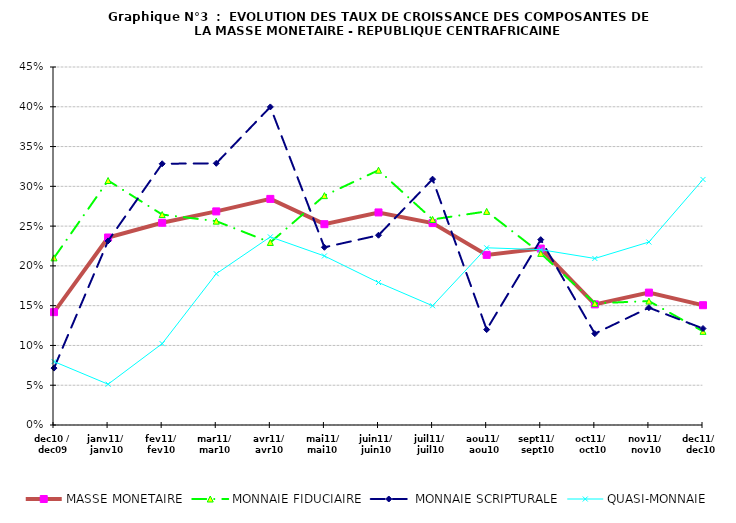
| Category | MASSE MONETAIRE | MONNAIE FIDUCIAIRE |  MONNAIE SCRIPTURALE | QUASI-MONNAIE |
|---|---|---|---|---|
| dec10 / dec09 | 0.142 | 0.21 | 0.072 | 0.08 |
| janv11/  janv10 | 0.236 | 0.307 | 0.231 | 0.051 |
| fev11/ fev10 | 0.254 | 0.265 | 0.328 | 0.102 |
| mar11/ mar10 | 0.268 | 0.256 | 0.329 | 0.19 |
| avr11/ avr10 | 0.284 | 0.229 | 0.4 | 0.236 |
| mai11/ mai10 | 0.252 | 0.288 | 0.223 | 0.212 |
| juin11/ juin10 | 0.267 | 0.32 | 0.239 | 0.179 |
| juil11/  juil10 | 0.254 | 0.258 | 0.309 | 0.15 |
| aou11/  aou10 | 0.214 | 0.269 | 0.12 | 0.223 |
| sept11/  sept10 | 0.222 | 0.216 | 0.233 | 0.22 |
| oct11/  oct10 | 0.152 | 0.153 | 0.115 | 0.209 |
| nov11/  nov10 | 0.166 | 0.156 | 0.147 | 0.23 |
| dec11/  dec10 | 0.151 | 0.118 | 0.121 | 0.309 |